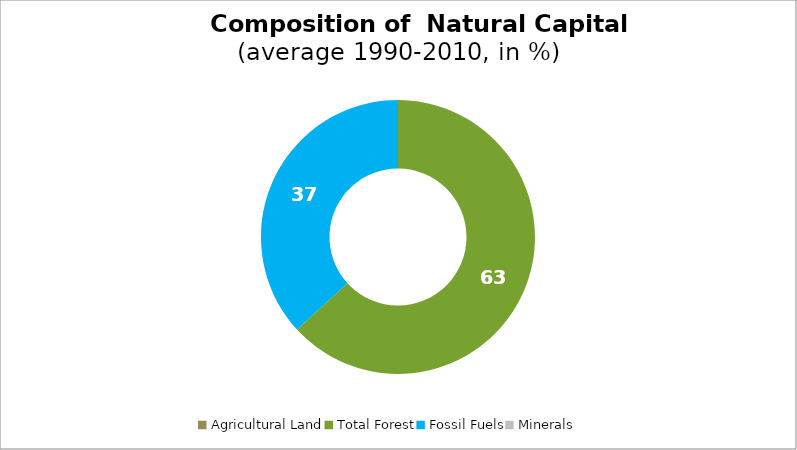
| Category | Series 0 |
|---|---|
| Agricultural Land | 0 |
| Total Forest | 63.202 |
| Fossil Fuels | 36.798 |
| Minerals | 0 |